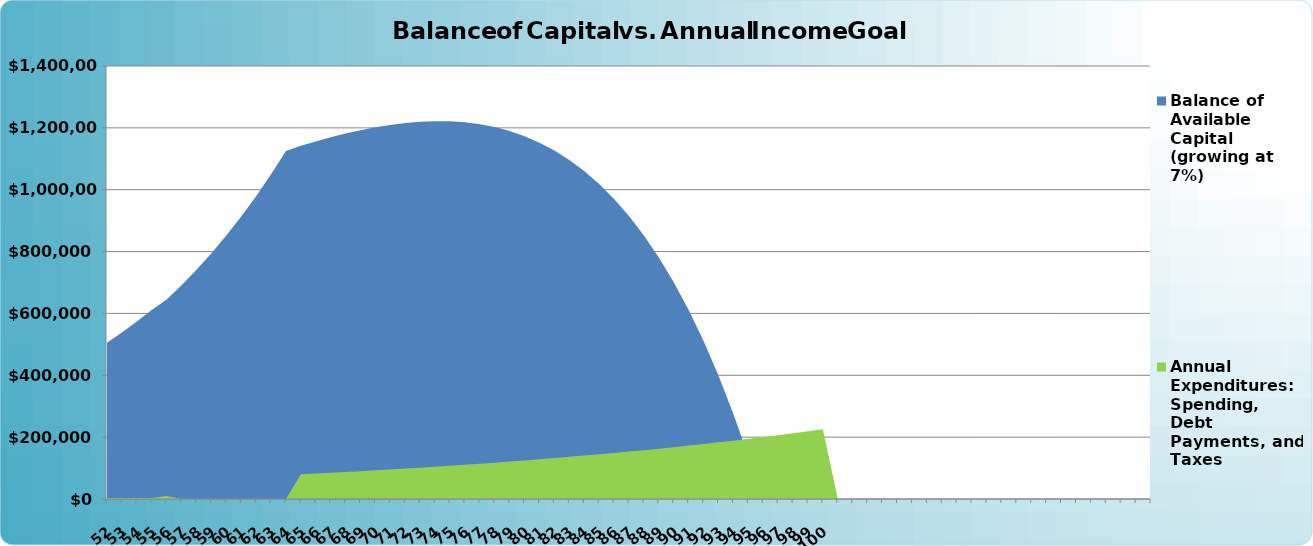
| Category | Balance of Available Capital (growing at 7%) | Annual Expenditures: Spending, Debt Payments, and Taxes |
|---|---|---|
| 52 | 505600 | 3600 |
| 53 | 538500 | 3600 |
| 54 | 573700 | 3600 |
| 55 | 611400 | 3600 |
| 56 | 644900 | 10000 |
| 57 | 691500 | 0 |
| 58 | 741500 | 0 |
| 59 | 794900 | 0 |
| 60 | 852200 | 0 |
| 61 | 913600 | 0 |
| 62 | 979200 | 0 |
| 63 | 1049600 | 0 |
| 64 | 1124900 | 0 |
| 65 | 1141800 | 80000 |
| 66 | 1156100 | 82400 |
| 67 | 1169300 | 84900 |
| 68 | 1181500 | 87500 |
| 69 | 1192300 | 90000 |
| 70 | 1201700 | 92800 |
| 71 | 1209500 | 95600 |
| 72 | 1215600 | 98400 |
| 73 | 1219600 | 101400 |
| 74 | 1221500 | 104500 |
| 75 | 1221000 | 107600 |
| 76 | 1217800 | 110800 |
| 77 | 1211700 | 114100 |
| 78 | 1202400 | 117500 |
| 79 | 1189500 | 121100 |
| 80 | 1172900 | 124700 |
| 81 | 1152000 | 128500 |
| 82 | 1126500 | 132300 |
| 83 | 1096100 | 136300 |
| 84 | 1060200 | 140300 |
| 85 | 1018300 | 144600 |
| 86 | 970000 | 148900 |
| 87 | 914700 | 153400 |
| 88 | 851900 | 158000 |
| 89 | 780700 | 162700 |
| 90 | 700600 | 167600 |
| 91 | 610900 | 172700 |
| 92 | 510600 | 177800 |
| 93 | 399000 | 183100 |
| 94 | 275100 | 188700 |
| 95 | 138000 | 194400 |
| 96 | 0 | 200200 |
| 97 | 0 | 206100 |
| 98 | 0 | 212300 |
| 99 | 0 | 218700 |
| 100 | 0 | 225300 |
|   | 0 | 0 |
|   | 0 | 0 |
|   | 0 | 0 |
|   | 0 | 0 |
|   | 0 | 0 |
|   | 0 | 0 |
|   | 0 | 0 |
|   | 0 | 0 |
|   | 0 | 0 |
|   | 0 | 0 |
|   | 0 | 0 |
|   | 0 | 0 |
|   | 0 | 0 |
|   | 0 | 0 |
|   | 0 | 0 |
|   | 0 | 0 |
|   | 0 | 0 |
|   | 0 | 0 |
|   | 0 | 0 |
|   | 0 | 0 |
|   | 0 | 0 |
|   | 0 | 0 |